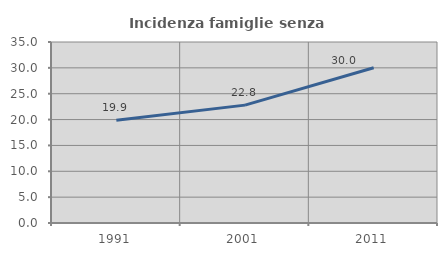
| Category | Incidenza famiglie senza nuclei |
|---|---|
| 1991.0 | 19.854 |
| 2001.0 | 22.793 |
| 2011.0 | 30.011 |